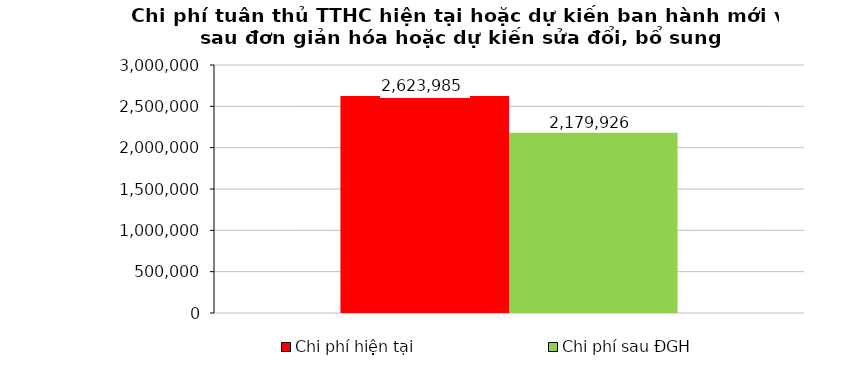
| Category | Chi phí hiện tại | Chi phí sau ĐGH |
|---|---|---|
| 0 | 2623985 | 2179926 |